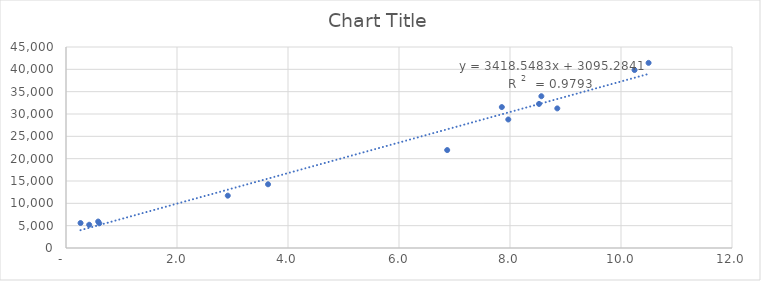
| Category | Series 0 |
|---|---|
| 10.24408602150538 | 39843.09 |
| 8.852210884353742 | 31254.24 |
| 8.523041474654379 | 32256.09 |
| 6.868492063492064 | 21923.79 |
| 2.9149001536098313 | 11716.89 |
| 0.5998412698412696 | 5527.21 |
| 0.26228878648233517 | 5592.81 |
| 0.41789554531490003 | 5202.06 |
| 0.5798412698412702 | 5923.28 |
| 3.6403993855606758 | 14264.16 |
| 7.96920634920635 | 28774.57 |
| 8.565053763440861 | 33978.31 |
| 10.496850998463904 | 41444.55 |
| 7.852873563218392 | 31551.48 |